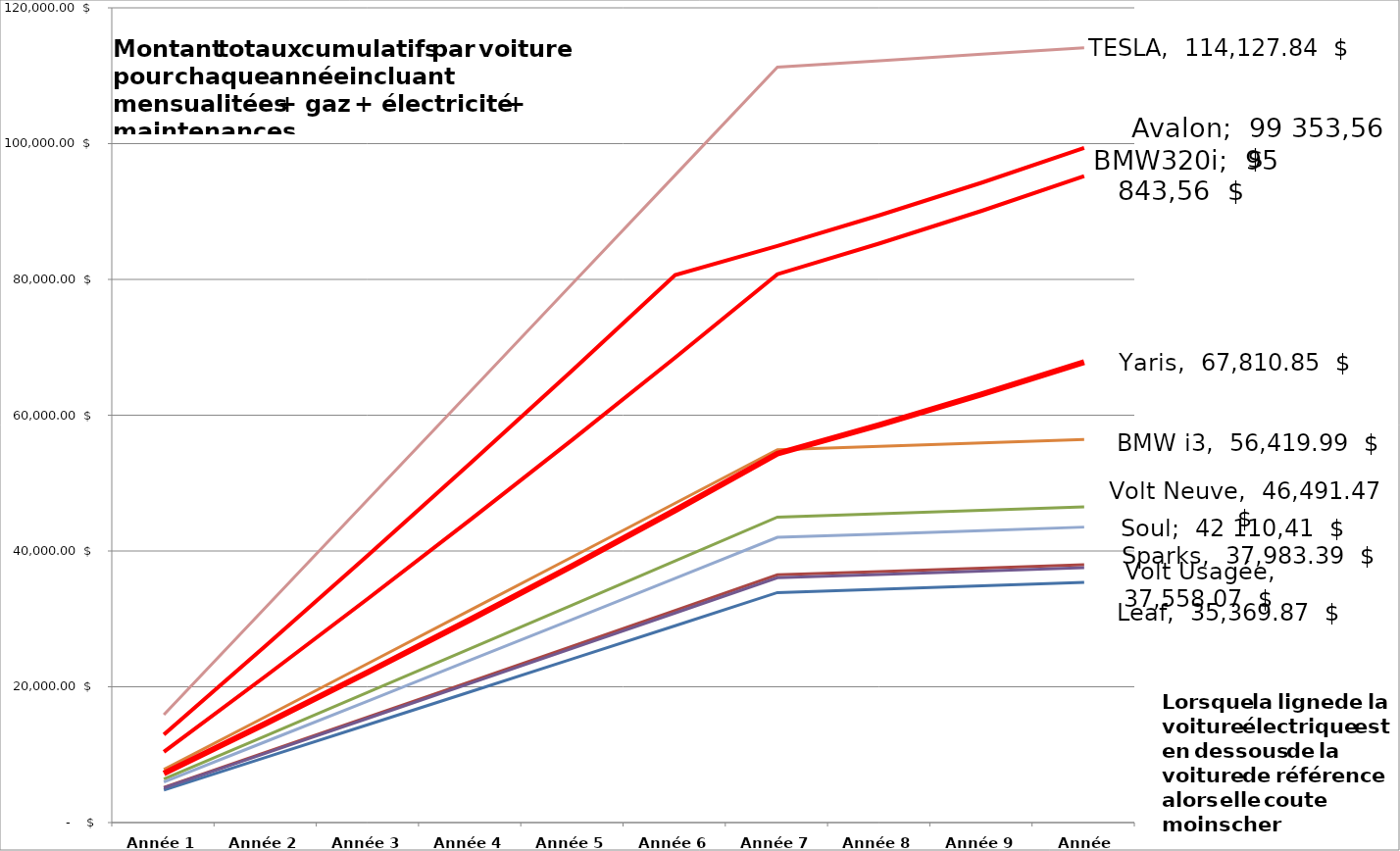
| Category | Leaf | Sparks | Volt Neuve | Volt Usagée | Soul | BMW i3 | TESLA | Yaris | Avalon | BMW320i |
|---|---|---|---|---|---|---|---|---|---|---|
| Année 1 | 4803.88 | 5177.24 | 6392.68 | 5116.48 | 5968.16 | 7811.04 | 15877.56 | 7232.443 | 12963.2 | 10406 |
| Année 2 | 9618.76 | 10365.48 | 12796.36 | 10243.96 | 11947.32 | 15633.08 | 31761.12 | 14624.886 | 26101.4 | 21626.6 |
| Année 3 | 14445.01 | 15565.09 | 19211.41 | 15382.81 | 17937.85 | 23466.49 | 47650.8 | 22186.828 | 39425.6 | 33033.2 |
| Année 4 | 19283.015 | 20776.455 | 25638.215 | 20533.415 | 23940.135 | 31311.655 | 63546.722 | 29928.396 | 52947.575 | 44637.575 |
| Année 5 | 24133.175 | 25999.975 | 32077.175 | 25696.175 | 29954.575 | 39168.975 | 79449.012 | 37860.385 | 66679.936 | 56452.336 |
| Année 6 | 28995.908 | 31236.068 | 38528.708 | 30871.508 | 35981.588 | 47038.868 | 95357.796 | 45994.313 | 80636.198 | 68490.998 |
| Année 7 | 33871.646 | 36485.166 | 44993.246 | 36059.846 | 42021.606 | 54921.766 | 111273.205 | 54342.473 | 84917.649 | 80768.049 |
| Année 8 | 34356.962 | 36970.482 | 45478.562 | 36545.162 | 42506.922 | 55407.082 | 112217.811 | 58585.549 | 89453.033 | 85303.433 |
| Année 9 | 34856.205 | 37469.725 | 45977.805 | 37044.405 | 43006.165 | 55906.325 | 113169.309 | 63070.01 | 94259.032 | 90109.432 |
| Année 10 | 35369.866 | 37983.386 | 46491.466 | 37558.066 | 43519.826 | 56419.986 | 114127.836 | 67810.847 | 99353.562 | 95203.962 |